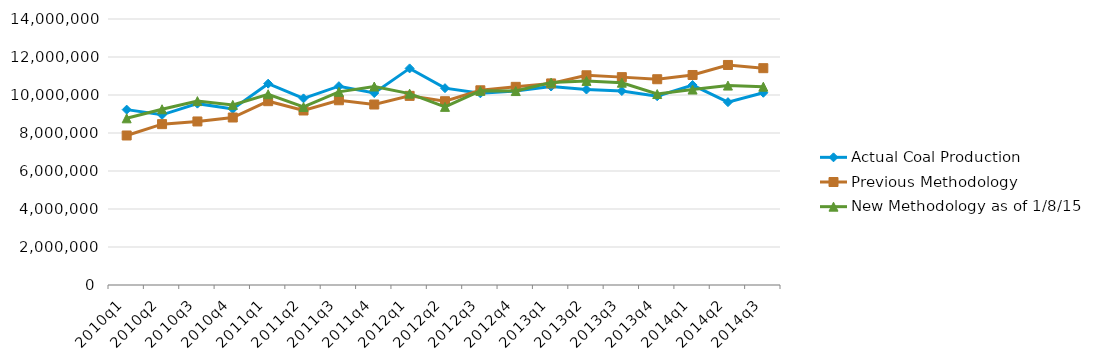
| Category | Actual Coal Production | Previous Methodology | New Methodology as of 1/8/15 |
|---|---|---|---|
| 2010q1 | 9230855 | 7868761 | 8772892 |
| 2010q2 | 8956196 | 8466818 | 9250493 |
| 2010q3 | 9544727 | 8607052 | 9679734 |
| 2010q4 | 9262630 | 8815563 | 9480552 |
| 2011q1 | 10596580 | 9674487 | 10041097 |
| 2011q2 | 9821805 | 9184584 | 9368519 |
| 2011q3 | 10463876 | 9723389 | 10164638 |
| 2011q4 | 10103710 | 9498538 | 10447345 |
| 2012q1 | 11400393 | 9954045 | 10072273 |
| 2012q2 | 10359301 | 9672152 | 9375557 |
| 2012q3 | 10088272 | 10248318 | 10218345 |
| 2012q4 | 10215524 | 10428696 | 10207541 |
| 2013q1 | 10446242 | 10608878 | 10652582 |
| 2013q2 | 10288106 | 11037790 | 10741469 |
| 2013q3 | 10209207 | 10940787 | 10646847 |
| 2013q4 | 9935408 | 10830277 | 10050318 |
| 2014q1 | 10524926 | 11053396 | 10286287 |
| 2014q2 | 9624035 | 11581111 | 10496013 |
| 2014q3 | 10116906 | 11411459 | 10436992 |